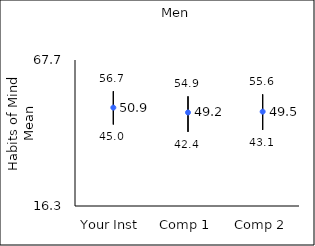
| Category | 25th percentile | 75th percentile | Mean |
|---|---|---|---|
| Your Inst | 45 | 56.7 | 50.94 |
| Comp 1 | 42.4 | 54.9 | 49.22 |
| Comp 2 | 43.1 | 55.6 | 49.52 |